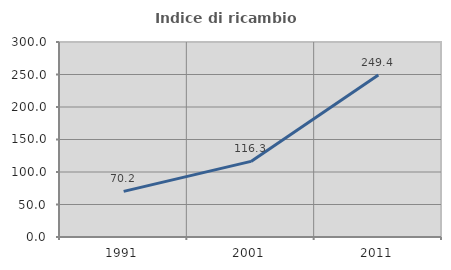
| Category | Indice di ricambio occupazionale  |
|---|---|
| 1991.0 | 70.165 |
| 2001.0 | 116.331 |
| 2011.0 | 249.389 |